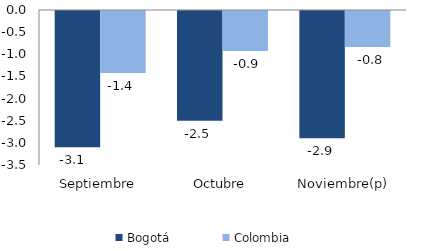
| Category | Bogotá | Colombia |
|---|---|---|
| Septiembre | -3.075 | -1.4 |
| Octubre | -2.48 | -0.903 |
| Noviembre(p) | -2.872 | -0.812 |